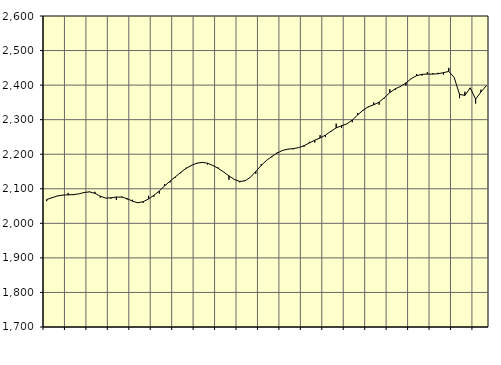
| Category | Piggar | Series 1 |
|---|---|---|
| nan | 2064.2 | 2068.97 |
| 1.0 | 2075.7 | 2074.08 |
| 1.0 | 2080.1 | 2079.1 |
| 1.0 | 2081.3 | 2081.82 |
| nan | 2088 | 2082.37 |
| 2.0 | 2081.6 | 2083.22 |
| 2.0 | 2085.2 | 2085.21 |
| 2.0 | 2087.8 | 2089.26 |
| nan | 2092.3 | 2090.95 |
| 3.0 | 2091.2 | 2086.73 |
| 3.0 | 2074.5 | 2078.58 |
| 3.0 | 2073.4 | 2072.97 |
| nan | 2071.7 | 2073.81 |
| 4.0 | 2067.8 | 2076.16 |
| 4.0 | 2077.8 | 2075.81 |
| 4.0 | 2069 | 2071.62 |
| nan | 2068.1 | 2064.11 |
| 5.0 | 2061.7 | 2059.54 |
| 5.0 | 2059.4 | 2062.64 |
| 5.0 | 2079.5 | 2070.58 |
| nan | 2077.3 | 2080.96 |
| 6.0 | 2086.3 | 2093.64 |
| 6.0 | 2113.9 | 2108.18 |
| 6.0 | 2118.3 | 2122.1 |
| nan | 2132.4 | 2134.39 |
| 7.0 | 2144.9 | 2147.58 |
| 7.0 | 2160.8 | 2158.97 |
| 7.0 | 2166.4 | 2167.66 |
| nan | 2171.9 | 2174.01 |
| 8.0 | 2176.8 | 2176.4 |
| 8.0 | 2170.3 | 2174.03 |
| 8.0 | 2168.4 | 2167.47 |
| nan | 2161.4 | 2159.15 |
| 9.0 | 2148.3 | 2148.66 |
| 9.0 | 2126.1 | 2137.26 |
| 9.0 | 2128 | 2126.98 |
| nan | 2118.7 | 2121.29 |
| 10.0 | 2124.3 | 2123.04 |
| 10.0 | 2133.9 | 2133.37 |
| 10.0 | 2143.7 | 2149.94 |
| nan | 2171.2 | 2167.47 |
| 11.0 | 2181.9 | 2182.08 |
| 11.0 | 2191.3 | 2193.44 |
| 11.0 | 2205.3 | 2203.35 |
| nan | 2210 | 2211.07 |
| 12.0 | 2214.2 | 2214.77 |
| 12.0 | 2214.3 | 2216.24 |
| 12.0 | 2218.9 | 2219.17 |
| nan | 2221.7 | 2224.67 |
| 13.0 | 2236 | 2232.62 |
| 13.0 | 2234.1 | 2240.57 |
| 13.0 | 2255.3 | 2247.01 |
| nan | 2249.5 | 2255.44 |
| 14.0 | 2264.1 | 2266.26 |
| 14.0 | 2288.4 | 2276.28 |
| 14.0 | 2276 | 2282.33 |
| nan | 2288.4 | 2287.82 |
| 15.0 | 2292.7 | 2298.94 |
| 15.0 | 2319.3 | 2313.67 |
| 15.0 | 2325.9 | 2327.29 |
| nan | 2336.1 | 2337.39 |
| 16.0 | 2349.8 | 2343.03 |
| 16.0 | 2343.4 | 2350.74 |
| 16.0 | 2361.8 | 2363.74 |
| nan | 2387.9 | 2378.41 |
| 17.0 | 2385.8 | 2389.15 |
| 17.0 | 2395 | 2396.18 |
| 17.0 | 2398.7 | 2406.25 |
| nan | 2417.4 | 2418.69 |
| 18.0 | 2432.2 | 2427.34 |
| 18.0 | 2427.6 | 2431.14 |
| 18.0 | 2437.3 | 2431.87 |
| nan | 2434.8 | 2431.87 |
| 19.0 | 2435.6 | 2432.85 |
| 19.0 | 2430 | 2436.04 |
| 19.0 | 2449.8 | 2439.58 |
| nan | 2422.3 | 2422.5 |
| 20.0 | 2362.2 | 2373.15 |
| 20.0 | 2380.8 | 2370.24 |
| 20.0 | 2388.2 | 2392.03 |
| nan | 2346.8 | 2359.63 |
| 21.0 | 2386.7 | 2380.27 |
| 21.0 | 2397.3 | 2398.16 |